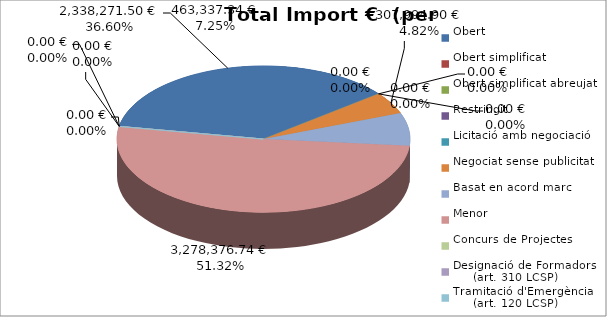
| Category | Total preu
(amb IVA) |
|---|---|
| Obert | 2338271.5 |
| Obert simplificat | 0 |
| Obert simplificat abreujat | 0 |
| Restringit | 0 |
| Licitació amb negociació | 0 |
| Negociat sense publicitat | 307994.898 |
| Basat en acord marc | 463337.34 |
| Menor | 3278376.735 |
| Concurs de Projectes | 0 |
| Designació de Formadors
     (art. 310 LCSP) | 0 |
| Tramitació d'Emergència
     (art. 120 LCSP) | 0 |